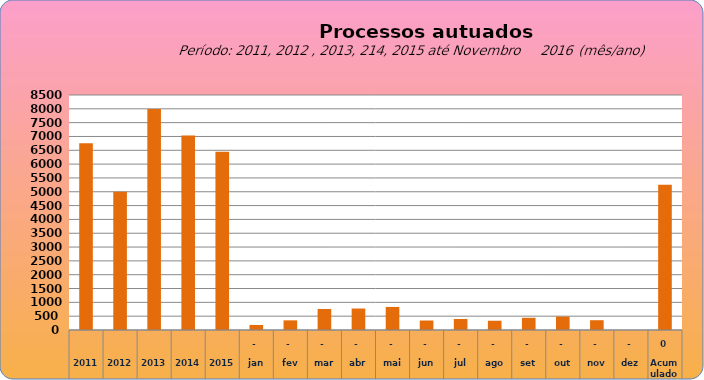
| Category | 6755 |
|---|---|
| 2011 | 6755 |
| 2012 | 4997 |
| 2013 | 7990 |
| 2014 | 7034 |
| 2015 | 6446 |
| jan | 182 |
| fev | 349 |
| mar | 760 |
| abr | 777 |
| mai | 834 |
| jun | 343 |
| jul | 397 |
| ago | 335 |
| set | 441 |
| out | 486 |
| nov | 354 |
| dez | 0 |
| Acumulado
 | 5258 |